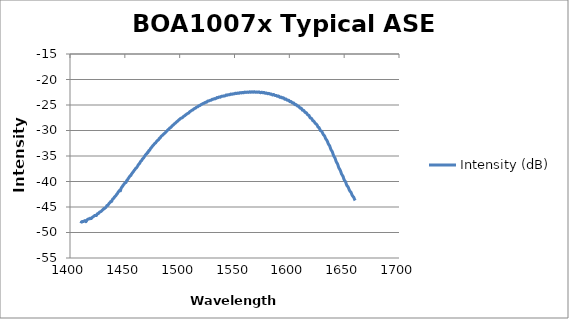
| Category | Intensity (dB) |
|---|---|
| 1410.0 | -48.203 |
| 1410.5 | -47.915 |
| 1411.0 | -47.871 |
| 1411.5 | -47.837 |
| 1412.0 | -47.842 |
| 1412.5 | -47.829 |
| 1413.0 | -47.729 |
| 1413.5 | -47.671 |
| 1414.0 | -47.69 |
| 1414.5 | -47.89 |
| 1415.0 | -47.742 |
| 1415.5 | -47.553 |
| 1416.0 | -47.447 |
| 1416.5 | -47.382 |
| 1417.0 | -47.336 |
| 1417.5 | -47.294 |
| 1418.0 | -47.326 |
| 1418.5 | -47.187 |
| 1419.0 | -47.246 |
| 1419.5 | -47.251 |
| 1420.0 | -47.096 |
| 1420.5 | -47.001 |
| 1421.0 | -46.928 |
| 1421.5 | -46.856 |
| 1422.0 | -46.761 |
| 1422.5 | -46.667 |
| 1423.0 | -46.668 |
| 1423.5 | -46.633 |
| 1424.0 | -46.687 |
| 1424.5 | -46.51 |
| 1425.0 | -46.333 |
| 1425.5 | -46.296 |
| 1426.0 | -46.262 |
| 1426.5 | -46.107 |
| 1427.0 | -46.002 |
| 1427.5 | -45.956 |
| 1428.0 | -45.889 |
| 1428.5 | -45.852 |
| 1429.0 | -45.718 |
| 1429.5 | -45.602 |
| 1430.0 | -45.512 |
| 1430.5 | -45.433 |
| 1431.0 | -45.275 |
| 1431.5 | -45.295 |
| 1432.0 | -45.19 |
| 1432.5 | -45.109 |
| 1433.0 | -44.975 |
| 1433.5 | -44.765 |
| 1434.0 | -44.684 |
| 1434.5 | -44.695 |
| 1435.0 | -44.509 |
| 1435.5 | -44.348 |
| 1436.0 | -44.203 |
| 1436.5 | -44.135 |
| 1437.0 | -43.956 |
| 1437.5 | -43.898 |
| 1438.0 | -43.897 |
| 1438.5 | -43.618 |
| 1439.0 | -43.439 |
| 1439.5 | -43.356 |
| 1440.0 | -43.275 |
| 1440.5 | -43.055 |
| 1441.0 | -42.93 |
| 1441.5 | -42.863 |
| 1442.0 | -42.727 |
| 1442.5 | -42.527 |
| 1443.0 | -42.433 |
| 1443.5 | -42.26 |
| 1444.0 | -42.069 |
| 1444.5 | -41.952 |
| 1445.0 | -41.778 |
| 1445.5 | -41.67 |
| 1446.0 | -41.827 |
| 1446.5 | -41.399 |
| 1447.0 | -41.192 |
| 1447.5 | -41.053 |
| 1448.0 | -40.888 |
| 1448.5 | -40.746 |
| 1449.0 | -40.589 |
| 1449.5 | -40.447 |
| 1450.0 | -40.326 |
| 1450.5 | -40.244 |
| 1451.0 | -40.205 |
| 1451.5 | -39.955 |
| 1452.0 | -39.744 |
| 1452.5 | -39.647 |
| 1453.0 | -39.443 |
| 1453.5 | -39.303 |
| 1454.0 | -39.142 |
| 1454.5 | -38.989 |
| 1455.0 | -38.844 |
| 1455.5 | -38.814 |
| 1456.0 | -38.589 |
| 1456.5 | -38.421 |
| 1457.0 | -38.277 |
| 1457.5 | -38.146 |
| 1458.0 | -38.019 |
| 1458.5 | -37.829 |
| 1459.0 | -37.708 |
| 1459.5 | -37.572 |
| 1460.0 | -37.41 |
| 1460.5 | -37.327 |
| 1461.0 | -37.204 |
| 1461.5 | -37.032 |
| 1462.0 | -36.838 |
| 1462.5 | -36.657 |
| 1463.0 | -36.524 |
| 1463.5 | -36.474 |
| 1464.0 | -36.21 |
| 1464.5 | -36.056 |
| 1465.0 | -35.933 |
| 1465.5 | -35.861 |
| 1466.0 | -35.622 |
| 1466.5 | -35.529 |
| 1467.0 | -35.406 |
| 1467.5 | -35.24 |
| 1468.0 | -35.067 |
| 1468.5 | -34.904 |
| 1469.0 | -34.76 |
| 1469.5 | -34.632 |
| 1470.0 | -34.578 |
| 1470.5 | -34.333 |
| 1471.0 | -34.345 |
| 1471.5 | -34.096 |
| 1472.0 | -33.908 |
| 1472.5 | -33.904 |
| 1473.0 | -33.71 |
| 1473.5 | -33.512 |
| 1474.0 | -33.413 |
| 1474.5 | -33.261 |
| 1475.0 | -33.128 |
| 1475.5 | -32.964 |
| 1476.0 | -32.885 |
| 1476.5 | -32.746 |
| 1477.0 | -32.62 |
| 1477.5 | -32.504 |
| 1478.0 | -32.436 |
| 1478.5 | -32.3 |
| 1479.0 | -32.115 |
| 1479.5 | -32.006 |
| 1480.0 | -31.92 |
| 1480.5 | -31.87 |
| 1481.0 | -31.727 |
| 1481.5 | -31.525 |
| 1482.0 | -31.508 |
| 1482.5 | -31.355 |
| 1483.0 | -31.194 |
| 1483.5 | -31.083 |
| 1484.0 | -30.99 |
| 1484.5 | -30.908 |
| 1485.0 | -30.777 |
| 1485.5 | -30.669 |
| 1486.0 | -30.594 |
| 1486.5 | -30.501 |
| 1487.0 | -30.406 |
| 1487.5 | -30.252 |
| 1488.0 | -30.177 |
| 1488.5 | -30.073 |
| 1489.0 | -29.928 |
| 1489.5 | -29.828 |
| 1490.0 | -29.779 |
| 1490.5 | -29.645 |
| 1491.0 | -29.516 |
| 1491.5 | -29.446 |
| 1492.0 | -29.387 |
| 1492.5 | -29.268 |
| 1493.0 | -29.125 |
| 1493.5 | -29.021 |
| 1494.0 | -28.945 |
| 1494.5 | -28.843 |
| 1495.0 | -28.719 |
| 1495.5 | -28.638 |
| 1496.0 | -28.572 |
| 1496.5 | -28.468 |
| 1497.0 | -28.345 |
| 1497.5 | -28.251 |
| 1498.0 | -28.196 |
| 1498.5 | -28.095 |
| 1499.0 | -27.963 |
| 1499.5 | -27.878 |
| 1500.0 | -27.82 |
| 1500.5 | -27.719 |
| 1501.0 | -27.608 |
| 1501.5 | -27.57 |
| 1502.0 | -27.538 |
| 1502.5 | -27.461 |
| 1503.0 | -27.358 |
| 1503.5 | -27.237 |
| 1504.0 | -27.18 |
| 1504.5 | -27.115 |
| 1505.0 | -27.028 |
| 1505.5 | -26.919 |
| 1506.0 | -26.885 |
| 1506.5 | -26.775 |
| 1507.0 | -26.687 |
| 1507.5 | -26.631 |
| 1508.0 | -26.599 |
| 1508.5 | -26.515 |
| 1509.0 | -26.356 |
| 1509.5 | -26.275 |
| 1510.0 | -26.212 |
| 1510.5 | -26.149 |
| 1511.0 | -26.058 |
| 1511.5 | -25.998 |
| 1512.0 | -25.958 |
| 1512.5 | -25.847 |
| 1513.0 | -25.753 |
| 1513.5 | -25.698 |
| 1514.0 | -25.658 |
| 1514.5 | -25.609 |
| 1515.0 | -25.49 |
| 1515.5 | -25.426 |
| 1516.0 | -25.378 |
| 1516.5 | -25.353 |
| 1517.0 | -25.214 |
| 1517.5 | -25.14 |
| 1518.0 | -25.138 |
| 1518.5 | -25.089 |
| 1519.0 | -24.991 |
| 1519.5 | -24.918 |
| 1520.0 | -24.871 |
| 1520.5 | -24.815 |
| 1521.0 | -24.744 |
| 1521.5 | -24.682 |
| 1522.0 | -24.664 |
| 1522.5 | -24.641 |
| 1523.0 | -24.544 |
| 1523.5 | -24.474 |
| 1524.0 | -24.476 |
| 1524.5 | -24.464 |
| 1525.0 | -24.372 |
| 1525.5 | -24.239 |
| 1526.0 | -24.218 |
| 1526.5 | -24.221 |
| 1527.0 | -24.15 |
| 1527.5 | -24.114 |
| 1528.0 | -24.073 |
| 1528.5 | -24.076 |
| 1529.0 | -24.011 |
| 1529.5 | -23.896 |
| 1530.0 | -23.862 |
| 1530.5 | -23.872 |
| 1531.0 | -23.846 |
| 1531.5 | -23.769 |
| 1532.0 | -23.745 |
| 1532.5 | -23.774 |
| 1533.0 | -23.723 |
| 1533.5 | -23.631 |
| 1534.0 | -23.538 |
| 1534.5 | -23.564 |
| 1535.0 | -23.558 |
| 1535.5 | -23.495 |
| 1536.0 | -23.435 |
| 1536.5 | -23.444 |
| 1537.0 | -23.47 |
| 1537.5 | -23.381 |
| 1538.0 | -23.298 |
| 1538.5 | -23.279 |
| 1539.0 | -23.302 |
| 1539.5 | -23.275 |
| 1540.0 | -23.212 |
| 1540.5 | -23.218 |
| 1541.0 | -23.244 |
| 1541.5 | -23.181 |
| 1542.0 | -23.08 |
| 1542.5 | -23.04 |
| 1543.0 | -23.081 |
| 1543.5 | -23.083 |
| 1544.0 | -23.017 |
| 1544.5 | -22.972 |
| 1545.0 | -22.99 |
| 1545.5 | -23 |
| 1546.0 | -22.927 |
| 1546.5 | -22.857 |
| 1547.0 | -22.861 |
| 1547.5 | -22.906 |
| 1548.0 | -22.874 |
| 1548.5 | -22.817 |
| 1549.0 | -22.817 |
| 1549.5 | -22.823 |
| 1550.0 | -22.798 |
| 1550.5 | -22.725 |
| 1551.0 | -22.699 |
| 1551.5 | -22.738 |
| 1552.0 | -22.747 |
| 1552.5 | -22.687 |
| 1553.0 | -22.647 |
| 1553.5 | -22.695 |
| 1554.0 | -22.716 |
| 1554.5 | -22.652 |
| 1555.0 | -22.574 |
| 1555.5 | -22.587 |
| 1556.0 | -22.63 |
| 1556.5 | -22.615 |
| 1557.0 | -22.551 |
| 1557.5 | -22.544 |
| 1558.0 | -22.602 |
| 1558.5 | -22.587 |
| 1559.0 | -22.502 |
| 1559.5 | -22.466 |
| 1560.0 | -22.503 |
| 1560.5 | -22.544 |
| 1561.0 | -22.504 |
| 1561.5 | -22.464 |
| 1562.0 | -22.488 |
| 1562.5 | -22.531 |
| 1563.0 | -22.509 |
| 1563.5 | -22.434 |
| 1564.0 | -22.421 |
| 1564.5 | -22.485 |
| 1565.0 | -22.503 |
| 1565.5 | -22.442 |
| 1566.0 | -22.413 |
| 1566.5 | -22.466 |
| 1567.0 | -22.499 |
| 1567.5 | -22.451 |
| 1568.0 | -22.391 |
| 1568.5 | -22.426 |
| 1569.0 | -22.51 |
| 1569.5 | -22.517 |
| 1570.0 | -22.447 |
| 1570.5 | -22.434 |
| 1571.0 | -22.495 |
| 1571.5 | -22.515 |
| 1572.0 | -22.459 |
| 1572.5 | -22.43 |
| 1573.0 | -22.504 |
| 1573.5 | -22.582 |
| 1574.0 | -22.573 |
| 1574.5 | -22.516 |
| 1575.0 | -22.51 |
| 1575.5 | -22.58 |
| 1576.0 | -22.598 |
| 1576.5 | -22.557 |
| 1577.0 | -22.529 |
| 1577.5 | -22.629 |
| 1578.0 | -22.698 |
| 1578.5 | -22.685 |
| 1579.0 | -22.651 |
| 1579.5 | -22.687 |
| 1580.0 | -22.76 |
| 1580.5 | -22.784 |
| 1581.0 | -22.731 |
| 1581.5 | -22.725 |
| 1582.0 | -22.805 |
| 1582.5 | -22.87 |
| 1583.0 | -22.873 |
| 1583.5 | -22.842 |
| 1584.0 | -22.924 |
| 1584.5 | -23.021 |
| 1585.0 | -23.032 |
| 1585.5 | -22.952 |
| 1586.0 | -22.974 |
| 1586.5 | -23.068 |
| 1587.0 | -23.138 |
| 1587.5 | -23.123 |
| 1588.0 | -23.116 |
| 1588.5 | -23.191 |
| 1589.0 | -23.301 |
| 1589.5 | -23.296 |
| 1590.0 | -23.24 |
| 1590.5 | -23.283 |
| 1591.0 | -23.428 |
| 1591.5 | -23.512 |
| 1592.0 | -23.484 |
| 1592.5 | -23.451 |
| 1593.0 | -23.509 |
| 1593.5 | -23.611 |
| 1594.0 | -23.631 |
| 1594.5 | -23.589 |
| 1595.0 | -23.646 |
| 1595.5 | -23.779 |
| 1596.0 | -23.893 |
| 1596.5 | -23.874 |
| 1597.0 | -23.832 |
| 1597.5 | -23.915 |
| 1598.0 | -24.051 |
| 1598.5 | -24.078 |
| 1599.0 | -24.049 |
| 1599.5 | -24.081 |
| 1600.0 | -24.218 |
| 1600.5 | -24.34 |
| 1601.0 | -24.341 |
| 1601.5 | -24.313 |
| 1602.0 | -24.401 |
| 1602.5 | -24.531 |
| 1603.0 | -24.621 |
| 1603.5 | -24.578 |
| 1604.0 | -24.601 |
| 1604.5 | -24.75 |
| 1605.0 | -24.915 |
| 1605.5 | -24.936 |
| 1606.0 | -24.914 |
| 1606.5 | -24.974 |
| 1607.0 | -25.111 |
| 1607.5 | -25.22 |
| 1608.0 | -25.214 |
| 1608.5 | -25.231 |
| 1609.0 | -25.383 |
| 1609.5 | -25.561 |
| 1610.0 | -25.626 |
| 1610.5 | -25.604 |
| 1611.0 | -25.666 |
| 1611.5 | -25.853 |
| 1612.0 | -26.023 |
| 1612.5 | -26.055 |
| 1613.0 | -26.046 |
| 1613.5 | -26.161 |
| 1614.0 | -26.347 |
| 1614.5 | -26.472 |
| 1615.0 | -26.473 |
| 1615.5 | -26.518 |
| 1616.0 | -26.692 |
| 1616.5 | -26.872 |
| 1617.0 | -26.979 |
| 1617.5 | -26.985 |
| 1618.0 | -27.057 |
| 1618.5 | -27.331 |
| 1619.0 | -27.519 |
| 1619.5 | -27.572 |
| 1620.0 | -27.589 |
| 1620.5 | -27.727 |
| 1621.0 | -27.907 |
| 1621.5 | -28.097 |
| 1622.0 | -28.114 |
| 1622.5 | -28.219 |
| 1623.0 | -28.388 |
| 1623.5 | -28.534 |
| 1624.0 | -28.661 |
| 1624.5 | -28.727 |
| 1625.0 | -28.862 |
| 1625.5 | -28.997 |
| 1626.0 | -29.264 |
| 1626.5 | -29.375 |
| 1627.0 | -29.411 |
| 1627.5 | -29.637 |
| 1628.0 | -29.864 |
| 1628.5 | -30.059 |
| 1629.0 | -30.085 |
| 1629.5 | -30.155 |
| 1630.0 | -30.336 |
| 1630.5 | -30.595 |
| 1631.0 | -30.797 |
| 1631.5 | -30.91 |
| 1632.0 | -31.035 |
| 1632.5 | -31.257 |
| 1633.0 | -31.537 |
| 1633.5 | -31.728 |
| 1634.0 | -31.852 |
| 1634.5 | -32.03 |
| 1635.0 | -32.31 |
| 1635.5 | -32.59 |
| 1636.0 | -32.782 |
| 1636.5 | -32.923 |
| 1637.0 | -33.158 |
| 1637.5 | -33.498 |
| 1638.0 | -33.774 |
| 1638.5 | -33.938 |
| 1639.0 | -34.09 |
| 1639.5 | -34.356 |
| 1640.0 | -34.702 |
| 1640.5 | -34.996 |
| 1641.0 | -35.166 |
| 1641.5 | -35.33 |
| 1642.0 | -35.615 |
| 1642.5 | -35.952 |
| 1643.0 | -36.225 |
| 1643.5 | -36.399 |
| 1644.0 | -36.59 |
| 1644.5 | -36.892 |
| 1645.0 | -37.231 |
| 1645.5 | -37.457 |
| 1646.0 | -37.62 |
| 1646.5 | -37.844 |
| 1647.0 | -38.156 |
| 1647.5 | -38.462 |
| 1648.0 | -38.664 |
| 1648.5 | -38.844 |
| 1649.0 | -39.007 |
| 1649.5 | -39.358 |
| 1650.0 | -39.65 |
| 1650.5 | -39.822 |
| 1651.0 | -39.957 |
| 1651.5 | -40.196 |
| 1652.0 | -40.529 |
| 1652.5 | -40.783 |
| 1653.0 | -40.922 |
| 1653.5 | -41.05 |
| 1654.0 | -41.269 |
| 1654.5 | -41.568 |
| 1655.0 | -41.805 |
| 1655.5 | -41.932 |
| 1656.0 | -42.053 |
| 1656.5 | -42.263 |
| 1657.0 | -42.544 |
| 1657.5 | -42.768 |
| 1658.0 | -42.912 |
| 1658.5 | -43.027 |
| 1659.0 | -43.241 |
| 1659.5 | -43.525 |
| 1660.0 | -43.718 |